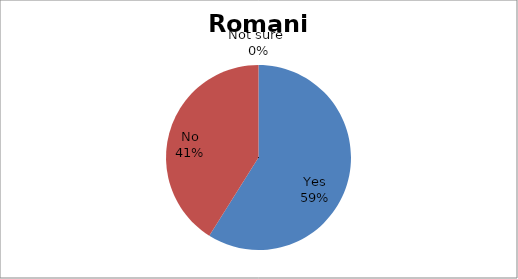
| Category | Series 0 |
|---|---|
| Yes | 66 |
| No | 46 |
| Not sure  | 0 |